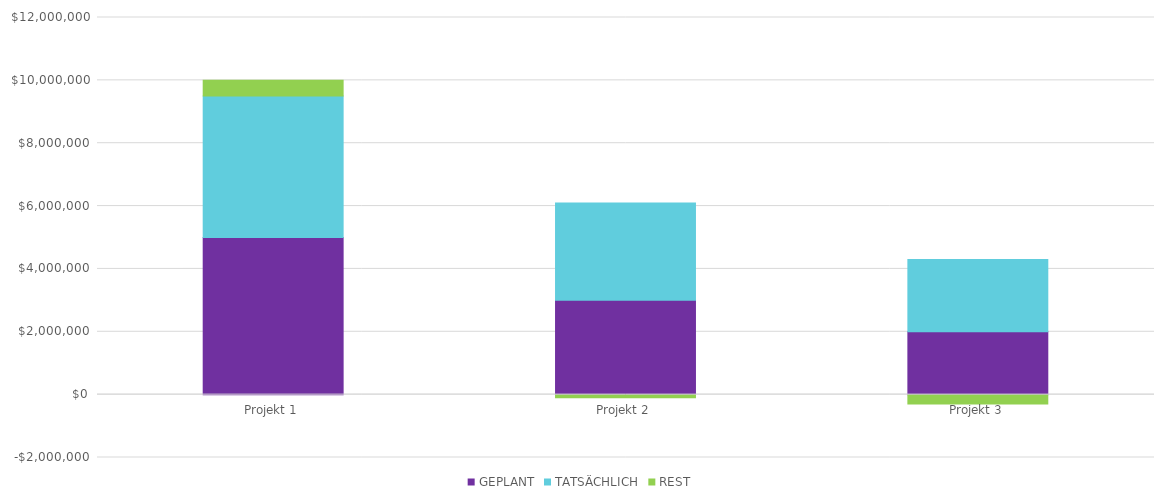
| Category | GEPLANT | TATSÄCHLICH | REST |
|---|---|---|---|
| Projekt 1 | 5000000 | 4500000 | 500000 |
| Projekt 2 | 3000000 | 3100000 | -100000 |
| Projekt 3 | 2000000 | 2300000 | -300000 |